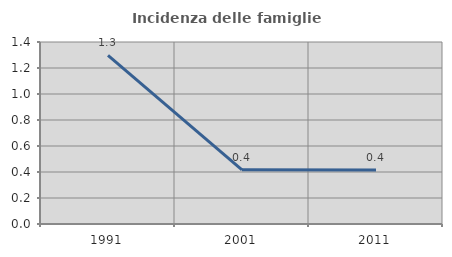
| Category | Incidenza delle famiglie numerose |
|---|---|
| 1991.0 | 1.297 |
| 2001.0 | 0.417 |
| 2011.0 | 0.416 |